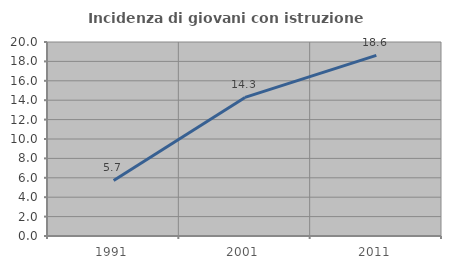
| Category | Incidenza di giovani con istruzione universitaria |
|---|---|
| 1991.0 | 5.732 |
| 2001.0 | 14.286 |
| 2011.0 | 18.627 |